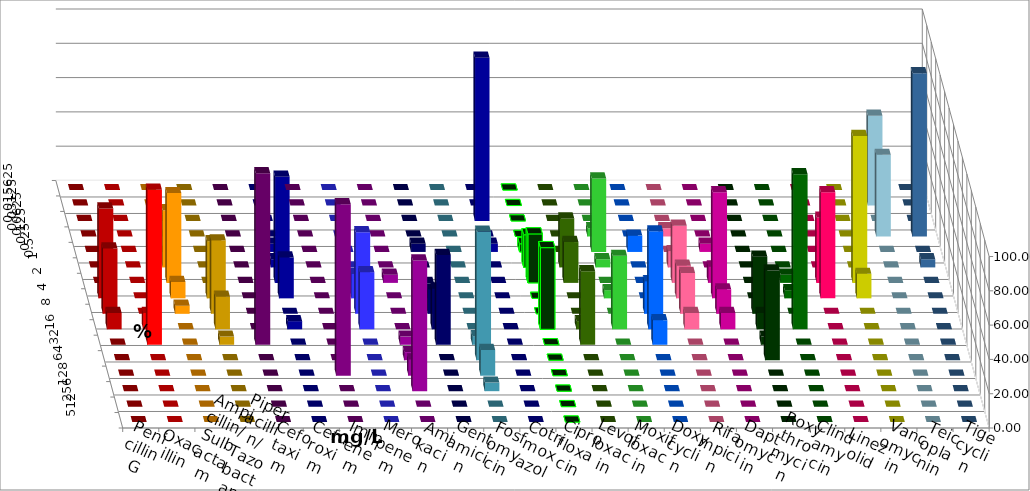
| Category | Penicillin G | Oxacillin | Ampicillin/ Sulbactam | Piperacillin/ Tazobactam | Cefotaxim | Cefuroxim | Imipenem | Meropenem | Amikacin | Gentamicin | Fosfomycin | Cotrimoxazol | Ciprofloxacin | Levofloxacin | Moxifloxacin | Doxycyclin | Rifampicin | Daptomycin | Roxythromycin | Clindamycin | Linezolid | Vancomycin | Teicoplanin | Tigecyclin |
|---|---|---|---|---|---|---|---|---|---|---|---|---|---|---|---|---|---|---|---|---|---|---|---|---|
| 0.015625 | 0 | 0 | 0 | 0 | 0 | 0 | 0 | 0 | 0 | 0 | 0 | 0 | 0 | 0 | 0 | 0 | 0 | 0 | 0 | 0 | 0 | 0 | 0 | 0 |
| 0.03125 | 0 | 0 | 0 | 0 | 0 | 0 | 0 | 0 | 0 | 0 | 0 | 0 | 0 | 0 | 0 | 0 | 0 | 0 | 0 | 0 | 0 | 0 | 0 | 52.381 |
| 0.0625 | 0 | 0 | 0 | 0 | 0 | 0 | 0 | 0 | 0 | 0 | 0 | 95.238 | 0 | 0 | 0 | 0 | 0 | 0 | 0 | 0 | 0 | 0 | 0 | 0 |
| 0.125 | 0 | 0 | 0 | 0 | 0 | 0 | 0 | 0 | 0 | 0 | 0 | 0 | 0 | 0 | 4.762 | 0 | 4.762 | 0 | 0 | 0 | 0 | 0 | 95.238 | 47.619 |
| 0.25 | 0 | 0 | 0 | 0 | 0 | 0 | 4.762 | 0 | 0 | 4.762 | 0 | 4.762 | 4.762 | 0 | 42.857 | 9.524 | 0 | 4.762 | 0 | 0 | 0 | 0 | 0 | 0 |
| 0.5 | 0 | 0 | 33.333 | 0 | 0 | 0 | 4.762 | 0 | 0 | 0 | 0 | 0 | 19.048 | 28.571 | 4.762 | 0 | 9.524 | 0 | 0 | 0 | 0 | 0 | 4.762 | 0 |
| 1.0 | 0 | 0 | 52.381 | 0 | 0 | 0 | 61.905 | 4.762 | 4.762 | 0 | 0 | 0 | 28.571 | 23.81 | 0 | 0 | 33.333 | 9.524 | 0 | 4.762 | 38.095 | 85.714 | 0 | 0 |
| 2.0 | 52.381 | 0 | 9.524 | 33.333 | 0 | 0 | 23.81 | 14.286 | 0 | 4.762 | 0 | 0 | 0 | 0 | 4.762 | 0 | 19.048 | 61.905 | 0 | 4.762 | 61.905 | 14.286 | 0 | 0 |
| 4.0 | 38.095 | 0 | 4.762 | 42.857 | 0 | 0 | 0 | 47.619 | 0 | 14.286 | 0 | 0 | 0 | 0 | 0 | 19.048 | 23.81 | 14.286 | 33.333 | 0 | 0 | 0 | 0 | 0 |
| 8.0 | 9.524 | 9.524 | 0 | 19.048 | 0 | 0 | 4.762 | 33.333 | 0 | 23.81 | 0 | 0 | 47.619 | 4.762 | 42.857 | 57.143 | 9.524 | 9.524 | 9.524 | 90.476 | 0 | 0 | 0 | 0 |
| 16.0 | 0 | 90.476 | 0 | 4.762 | 100 | 0 | 0 | 0 | 4.762 | 52.381 | 5 | 0 | 0 | 42.857 | 0 | 14.286 | 0 | 0 | 4.762 | 0 | 0 | 0 | 0 | 0 |
| 32.0 | 0 | 0 | 0 | 0 | 0 | 0 | 0 | 0 | 4.762 | 0 | 75 | 0 | 0 | 0 | 0 | 0 | 0 | 0 | 52.381 | 0 | 0 | 0 | 0 | 0 |
| 64.0 | 0 | 0 | 0 | 0 | 0 | 100 | 0 | 0 | 9.524 | 0 | 15 | 0 | 0 | 0 | 0 | 0 | 0 | 0 | 0 | 0 | 0 | 0 | 0 | 0 |
| 128.0 | 0 | 0 | 0 | 0 | 0 | 0 | 0 | 0 | 76.19 | 0 | 5 | 0 | 0 | 0 | 0 | 0 | 0 | 0 | 0 | 0 | 0 | 0 | 0 | 0 |
| 256.0 | 0 | 0 | 0 | 0 | 0 | 0 | 0 | 0 | 0 | 0 | 0 | 0 | 0 | 0 | 0 | 0 | 0 | 0 | 0 | 0 | 0 | 0 | 0 | 0 |
| 512.0 | 0 | 0 | 0 | 0 | 0 | 0 | 0 | 0 | 0 | 0 | 0 | 0 | 0 | 0 | 0 | 0 | 0 | 0 | 0 | 0 | 0 | 0 | 0 | 0 |